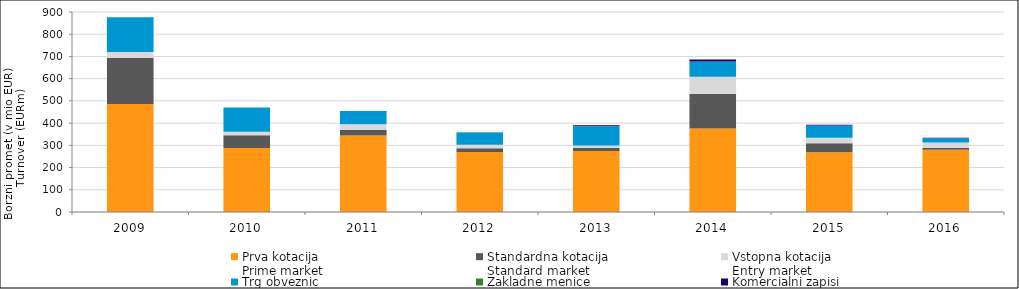
| Category | Prva kotacija
Prime market | Standardna kotacija
Standard market | Vstopna kotacija
Entry market | Trg obveznic
Bond market | Zakladne menice
Treasury bills | Komercialni zapisi
Comercial papers |
|---|---|---|---|---|---|---|
| 2009 | 485.764 | 208.53 | 25.516 | 156.344 | 0 | 0 |
| 2010 | 288.01 | 57.592 | 15.19 | 108.903 | 0 | 0 |
| 2011 | 344.728 | 25.476 | 24.272 | 59.58 | 0 | 0 |
| 2012 | 270.163 | 16.945 | 15.759 | 55.393 | 0.067 | 0.27 |
| 2013 | 274.969 | 14.128 | 10.291 | 86.079 | 0.004 | 4.517 |
| 2014 | 375.338 | 155.61 | 77.116 | 69.033 | 0.17 | 9.053 |
| 2015 | 268.653 | 40.915 | 24.1 | 55.883 | 0 | 3.513 |
| 2016 | 280.227 | 7.955 | 24.796 | 18.575 | 0 | 2.121 |